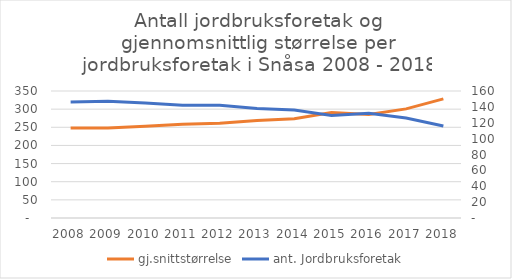
| Category | gj.snittstørrelse |
|---|---|
| 2008 | 247.726 |
| 2009 | 247.925 |
| 2010 | 253.172 |
| 2011 | 258.359 |
| 2012 | 260.937 |
| 2013 | 268.688 |
| 2014 | 273.279 |
| 2015 | 290.884 |
| 2016 | 285.235 |
| 2017 | 300.706 |
| 2018 | 328.371 |